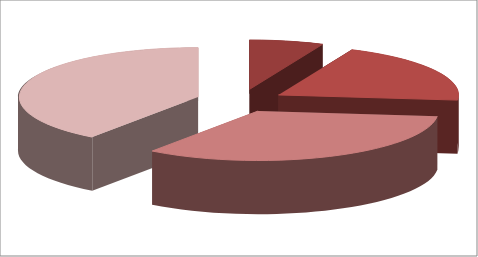
| Category | Series 0 |
|---|---|
| 0 | 1 |
| 1 | 3 |
| 2 | 5 |
| 3 | 6 |